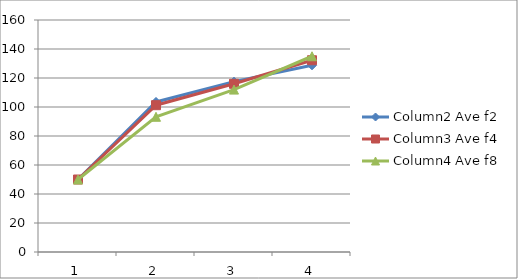
| Category | Column2 Ave f2 | Column3 Ave f4 | Column4 Ave f8 |
|---|---|---|---|
| 0 | 50 | 50 | 50 |
| 1 | 103.5 | 101.25 | 93.25 |
| 2 | 117.5 | 116 | 112 |
| 3 | 128.75 | 132.25 | 135 |